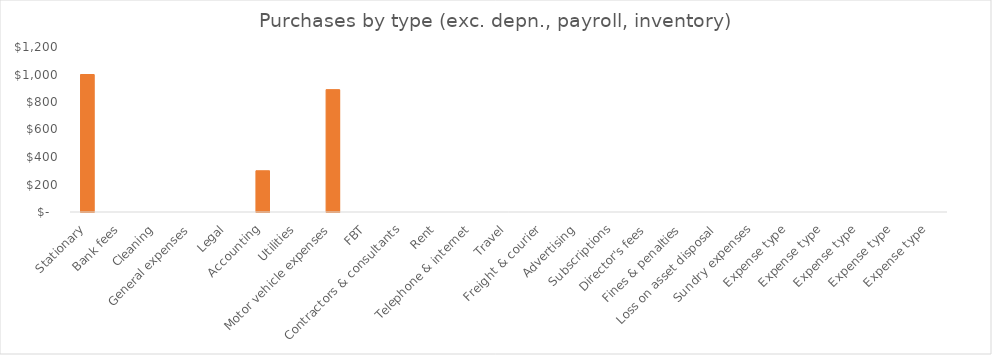
| Category | Purchases |
|---|---|
| Stationary | 1000 |
| Bank fees | 0 |
| Cleaning | 0 |
| General expenses | 0 |
| Legal | 0 |
| Accounting | 300 |
| Utilities | 0 |
| Motor vehicle expenses | 890 |
| FBT | 0 |
| Contractors & consultants | 0 |
| Rent | 0 |
| Telephone & internet | 0 |
| Travel | 0 |
| Freight & courier | 0 |
| Advertising | 0 |
| Subscriptions | 0 |
| Director's fees | 0 |
| Fines & penalties | 0 |
| Loss on asset disposal | 0 |
| Sundry expenses | 0 |
| Expense type | 0 |
| Expense type | 0 |
| Expense type | 0 |
| Expense type | 0 |
| Expense type | 0 |